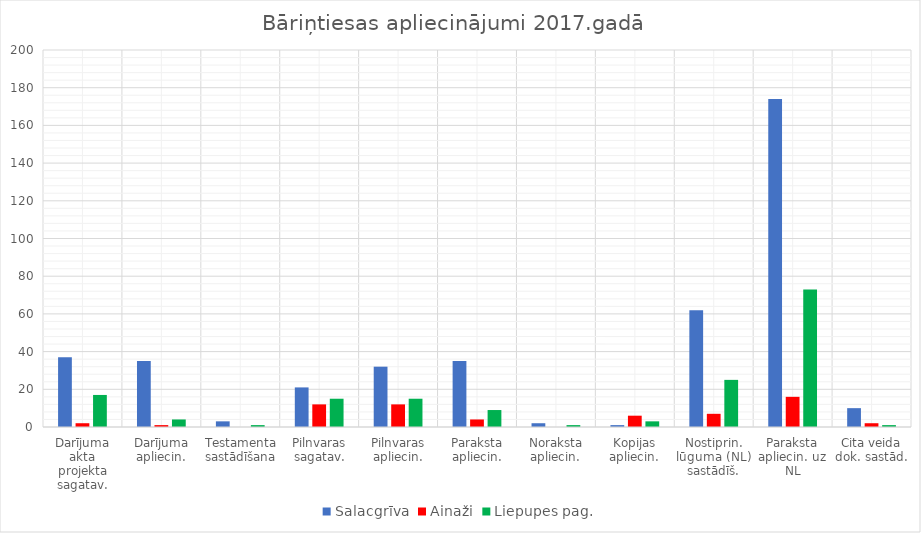
| Category | Salacgrīva | Ainaži | Liepupes pag. |
|---|---|---|---|
| Darījuma akta projekta sagatav. | 37 | 2 | 17 |
| Darījuma apliecin. | 35 | 1 | 4 |
| Testamenta sastādīšana | 3 | 0 | 1 |
| Pilnvaras sagatav. | 21 | 12 | 15 |
| Pilnvaras apliecin. | 32 | 12 | 15 |
| Paraksta apliecin. | 35 | 4 | 9 |
| Noraksta apliecin. | 2 | 0 | 1 |
| Kopijas apliecin. | 1 | 6 | 3 |
| Nostiprin. lūguma (NL) sastādīš. | 62 | 7 | 25 |
| Paraksta apliecin. uz NL | 174 | 16 | 73 |
| Cita veida dok. sastād. | 10 | 2 | 1 |